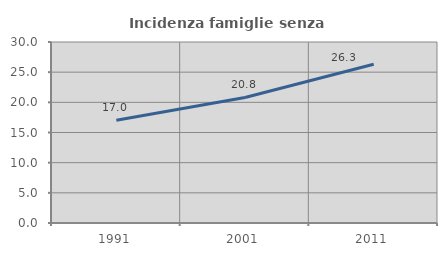
| Category | Incidenza famiglie senza nuclei |
|---|---|
| 1991.0 | 17.023 |
| 2001.0 | 20.803 |
| 2011.0 | 26.317 |